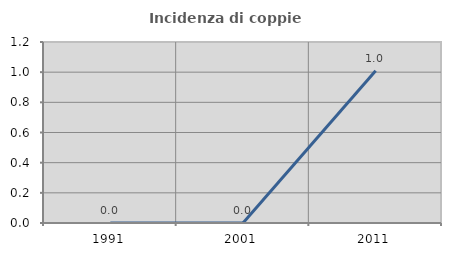
| Category | Incidenza di coppie miste |
|---|---|
| 1991.0 | 0 |
| 2001.0 | 0 |
| 2011.0 | 1.01 |